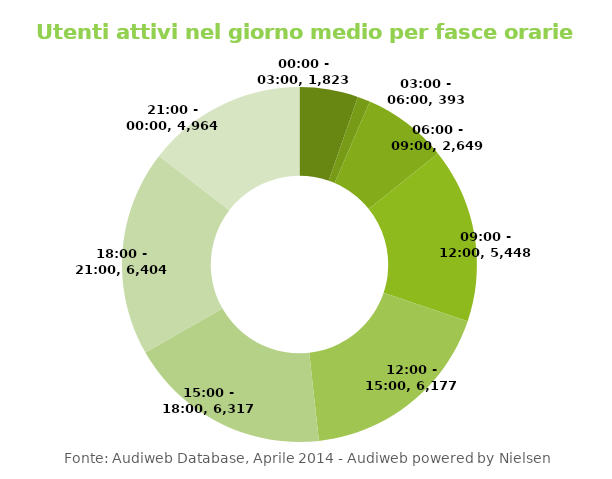
| Category | Series 0 |
|---|---|
| 00:00 - 03:00 | 1823 |
| 03:00 - 06:00 | 393 |
| 06:00 - 09:00 | 2649 |
| 09:00 - 12:00 | 5448 |
| 12:00 - 15:00 | 6177 |
| 15:00 - 18:00 | 6317 |
| 18:00 - 21:00 | 6404 |
| 21:00 - 00:00 | 4964 |